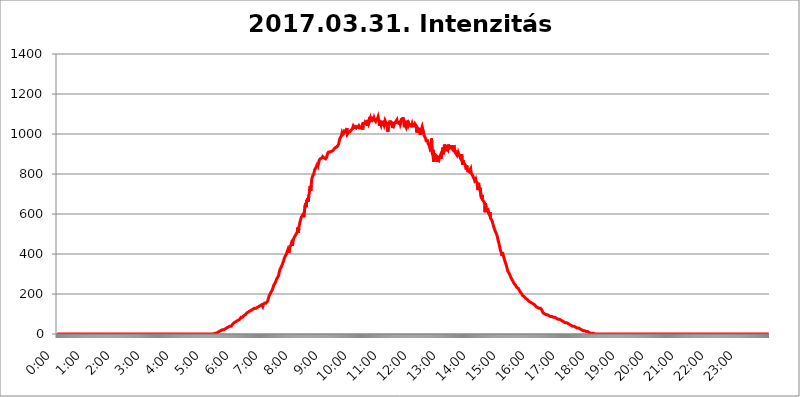
| Category | 2017.03.31. Intenzitás [W/m^2] |
|---|---|
| 0.0 | 0 |
| 0.0006944444444444445 | 0 |
| 0.001388888888888889 | 0 |
| 0.0020833333333333333 | 0 |
| 0.002777777777777778 | 0 |
| 0.003472222222222222 | 0 |
| 0.004166666666666667 | 0 |
| 0.004861111111111111 | 0 |
| 0.005555555555555556 | 0 |
| 0.0062499999999999995 | 0 |
| 0.006944444444444444 | 0 |
| 0.007638888888888889 | 0 |
| 0.008333333333333333 | 0 |
| 0.009027777777777779 | 0 |
| 0.009722222222222222 | 0 |
| 0.010416666666666666 | 0 |
| 0.011111111111111112 | 0 |
| 0.011805555555555555 | 0 |
| 0.012499999999999999 | 0 |
| 0.013194444444444444 | 0 |
| 0.013888888888888888 | 0 |
| 0.014583333333333332 | 0 |
| 0.015277777777777777 | 0 |
| 0.015972222222222224 | 0 |
| 0.016666666666666666 | 0 |
| 0.017361111111111112 | 0 |
| 0.018055555555555557 | 0 |
| 0.01875 | 0 |
| 0.019444444444444445 | 0 |
| 0.02013888888888889 | 0 |
| 0.020833333333333332 | 0 |
| 0.02152777777777778 | 0 |
| 0.022222222222222223 | 0 |
| 0.02291666666666667 | 0 |
| 0.02361111111111111 | 0 |
| 0.024305555555555556 | 0 |
| 0.024999999999999998 | 0 |
| 0.025694444444444447 | 0 |
| 0.02638888888888889 | 0 |
| 0.027083333333333334 | 0 |
| 0.027777777777777776 | 0 |
| 0.02847222222222222 | 0 |
| 0.029166666666666664 | 0 |
| 0.029861111111111113 | 0 |
| 0.030555555555555555 | 0 |
| 0.03125 | 0 |
| 0.03194444444444445 | 0 |
| 0.03263888888888889 | 0 |
| 0.03333333333333333 | 0 |
| 0.034027777777777775 | 0 |
| 0.034722222222222224 | 0 |
| 0.035416666666666666 | 0 |
| 0.036111111111111115 | 0 |
| 0.03680555555555556 | 0 |
| 0.0375 | 0 |
| 0.03819444444444444 | 0 |
| 0.03888888888888889 | 0 |
| 0.03958333333333333 | 0 |
| 0.04027777777777778 | 0 |
| 0.04097222222222222 | 0 |
| 0.041666666666666664 | 0 |
| 0.042361111111111106 | 0 |
| 0.04305555555555556 | 0 |
| 0.043750000000000004 | 0 |
| 0.044444444444444446 | 0 |
| 0.04513888888888889 | 0 |
| 0.04583333333333334 | 0 |
| 0.04652777777777778 | 0 |
| 0.04722222222222222 | 0 |
| 0.04791666666666666 | 0 |
| 0.04861111111111111 | 0 |
| 0.049305555555555554 | 0 |
| 0.049999999999999996 | 0 |
| 0.05069444444444445 | 0 |
| 0.051388888888888894 | 0 |
| 0.052083333333333336 | 0 |
| 0.05277777777777778 | 0 |
| 0.05347222222222222 | 0 |
| 0.05416666666666667 | 0 |
| 0.05486111111111111 | 0 |
| 0.05555555555555555 | 0 |
| 0.05625 | 0 |
| 0.05694444444444444 | 0 |
| 0.057638888888888885 | 0 |
| 0.05833333333333333 | 0 |
| 0.05902777777777778 | 0 |
| 0.059722222222222225 | 0 |
| 0.06041666666666667 | 0 |
| 0.061111111111111116 | 0 |
| 0.06180555555555556 | 0 |
| 0.0625 | 0 |
| 0.06319444444444444 | 0 |
| 0.06388888888888888 | 0 |
| 0.06458333333333334 | 0 |
| 0.06527777777777778 | 0 |
| 0.06597222222222222 | 0 |
| 0.06666666666666667 | 0 |
| 0.06736111111111111 | 0 |
| 0.06805555555555555 | 0 |
| 0.06874999999999999 | 0 |
| 0.06944444444444443 | 0 |
| 0.07013888888888889 | 0 |
| 0.07083333333333333 | 0 |
| 0.07152777777777779 | 0 |
| 0.07222222222222223 | 0 |
| 0.07291666666666667 | 0 |
| 0.07361111111111111 | 0 |
| 0.07430555555555556 | 0 |
| 0.075 | 0 |
| 0.07569444444444444 | 0 |
| 0.0763888888888889 | 0 |
| 0.07708333333333334 | 0 |
| 0.07777777777777778 | 0 |
| 0.07847222222222222 | 0 |
| 0.07916666666666666 | 0 |
| 0.0798611111111111 | 0 |
| 0.08055555555555556 | 0 |
| 0.08125 | 0 |
| 0.08194444444444444 | 0 |
| 0.08263888888888889 | 0 |
| 0.08333333333333333 | 0 |
| 0.08402777777777777 | 0 |
| 0.08472222222222221 | 0 |
| 0.08541666666666665 | 0 |
| 0.08611111111111112 | 0 |
| 0.08680555555555557 | 0 |
| 0.08750000000000001 | 0 |
| 0.08819444444444445 | 0 |
| 0.08888888888888889 | 0 |
| 0.08958333333333333 | 0 |
| 0.09027777777777778 | 0 |
| 0.09097222222222222 | 0 |
| 0.09166666666666667 | 0 |
| 0.09236111111111112 | 0 |
| 0.09305555555555556 | 0 |
| 0.09375 | 0 |
| 0.09444444444444444 | 0 |
| 0.09513888888888888 | 0 |
| 0.09583333333333333 | 0 |
| 0.09652777777777777 | 0 |
| 0.09722222222222222 | 0 |
| 0.09791666666666667 | 0 |
| 0.09861111111111111 | 0 |
| 0.09930555555555555 | 0 |
| 0.09999999999999999 | 0 |
| 0.10069444444444443 | 0 |
| 0.1013888888888889 | 0 |
| 0.10208333333333335 | 0 |
| 0.10277777777777779 | 0 |
| 0.10347222222222223 | 0 |
| 0.10416666666666667 | 0 |
| 0.10486111111111111 | 0 |
| 0.10555555555555556 | 0 |
| 0.10625 | 0 |
| 0.10694444444444444 | 0 |
| 0.1076388888888889 | 0 |
| 0.10833333333333334 | 0 |
| 0.10902777777777778 | 0 |
| 0.10972222222222222 | 0 |
| 0.1111111111111111 | 0 |
| 0.11180555555555556 | 0 |
| 0.11180555555555556 | 0 |
| 0.1125 | 0 |
| 0.11319444444444444 | 0 |
| 0.11388888888888889 | 0 |
| 0.11458333333333333 | 0 |
| 0.11527777777777777 | 0 |
| 0.11597222222222221 | 0 |
| 0.11666666666666665 | 0 |
| 0.1173611111111111 | 0 |
| 0.11805555555555557 | 0 |
| 0.11944444444444445 | 0 |
| 0.12013888888888889 | 0 |
| 0.12083333333333333 | 0 |
| 0.12152777777777778 | 0 |
| 0.12222222222222223 | 0 |
| 0.12291666666666667 | 0 |
| 0.12291666666666667 | 0 |
| 0.12361111111111112 | 0 |
| 0.12430555555555556 | 0 |
| 0.125 | 0 |
| 0.12569444444444444 | 0 |
| 0.12638888888888888 | 0 |
| 0.12708333333333333 | 0 |
| 0.16875 | 0 |
| 0.12847222222222224 | 0 |
| 0.12916666666666668 | 0 |
| 0.12986111111111112 | 0 |
| 0.13055555555555556 | 0 |
| 0.13125 | 0 |
| 0.13194444444444445 | 0 |
| 0.1326388888888889 | 0 |
| 0.13333333333333333 | 0 |
| 0.13402777777777777 | 0 |
| 0.13402777777777777 | 0 |
| 0.13472222222222222 | 0 |
| 0.13541666666666666 | 0 |
| 0.1361111111111111 | 0 |
| 0.13749999999999998 | 0 |
| 0.13819444444444443 | 0 |
| 0.1388888888888889 | 0 |
| 0.13958333333333334 | 0 |
| 0.14027777777777778 | 0 |
| 0.14097222222222222 | 0 |
| 0.14166666666666666 | 0 |
| 0.1423611111111111 | 0 |
| 0.14305555555555557 | 0 |
| 0.14375000000000002 | 0 |
| 0.14444444444444446 | 0 |
| 0.1451388888888889 | 0 |
| 0.1451388888888889 | 0 |
| 0.14652777777777778 | 0 |
| 0.14722222222222223 | 0 |
| 0.14791666666666667 | 0 |
| 0.1486111111111111 | 0 |
| 0.14930555555555555 | 0 |
| 0.15 | 0 |
| 0.15069444444444444 | 0 |
| 0.15138888888888888 | 0 |
| 0.15208333333333332 | 0 |
| 0.15277777777777776 | 0 |
| 0.15347222222222223 | 0 |
| 0.15416666666666667 | 0 |
| 0.15486111111111112 | 0 |
| 0.15555555555555556 | 0 |
| 0.15625 | 0 |
| 0.15694444444444444 | 0 |
| 0.15763888888888888 | 0 |
| 0.15833333333333333 | 0 |
| 0.15902777777777777 | 0 |
| 0.15972222222222224 | 0 |
| 0.16041666666666668 | 0 |
| 0.16111111111111112 | 0 |
| 0.16180555555555556 | 0 |
| 0.1625 | 0 |
| 0.16319444444444445 | 0 |
| 0.1638888888888889 | 0 |
| 0.16458333333333333 | 0 |
| 0.16527777777777777 | 0 |
| 0.16597222222222222 | 0 |
| 0.16666666666666666 | 0 |
| 0.1673611111111111 | 0 |
| 0.16805555555555554 | 0 |
| 0.16874999999999998 | 0 |
| 0.16944444444444443 | 0 |
| 0.17013888888888887 | 0 |
| 0.1708333333333333 | 0 |
| 0.17152777777777775 | 0 |
| 0.17222222222222225 | 0 |
| 0.1729166666666667 | 0 |
| 0.17361111111111113 | 0 |
| 0.17430555555555557 | 0 |
| 0.17500000000000002 | 0 |
| 0.17569444444444446 | 0 |
| 0.1763888888888889 | 0 |
| 0.17708333333333334 | 0 |
| 0.17777777777777778 | 0 |
| 0.17847222222222223 | 0 |
| 0.17916666666666667 | 0 |
| 0.1798611111111111 | 0 |
| 0.18055555555555555 | 0 |
| 0.18125 | 0 |
| 0.18194444444444444 | 0 |
| 0.1826388888888889 | 0 |
| 0.18333333333333335 | 0 |
| 0.1840277777777778 | 0 |
| 0.18472222222222223 | 0 |
| 0.18541666666666667 | 0 |
| 0.18611111111111112 | 0 |
| 0.18680555555555556 | 0 |
| 0.1875 | 0 |
| 0.18819444444444444 | 0 |
| 0.18888888888888888 | 0 |
| 0.18958333333333333 | 0 |
| 0.19027777777777777 | 0 |
| 0.1909722222222222 | 0 |
| 0.19166666666666665 | 0 |
| 0.19236111111111112 | 0 |
| 0.19305555555555554 | 0 |
| 0.19375 | 0 |
| 0.19444444444444445 | 0 |
| 0.1951388888888889 | 0 |
| 0.19583333333333333 | 0 |
| 0.19652777777777777 | 0 |
| 0.19722222222222222 | 0 |
| 0.19791666666666666 | 0 |
| 0.1986111111111111 | 0 |
| 0.19930555555555554 | 0 |
| 0.19999999999999998 | 0 |
| 0.20069444444444443 | 0 |
| 0.20138888888888887 | 0 |
| 0.2020833333333333 | 0 |
| 0.2027777777777778 | 0 |
| 0.2034722222222222 | 0 |
| 0.2041666666666667 | 0 |
| 0.20486111111111113 | 0 |
| 0.20555555555555557 | 0 |
| 0.20625000000000002 | 0 |
| 0.20694444444444446 | 0 |
| 0.2076388888888889 | 0 |
| 0.20833333333333334 | 0 |
| 0.20902777777777778 | 0 |
| 0.20972222222222223 | 0 |
| 0.21041666666666667 | 0 |
| 0.2111111111111111 | 0 |
| 0.21180555555555555 | 0 |
| 0.2125 | 0 |
| 0.21319444444444444 | 0 |
| 0.2138888888888889 | 0 |
| 0.21458333333333335 | 0 |
| 0.2152777777777778 | 0 |
| 0.21597222222222223 | 0 |
| 0.21666666666666667 | 0 |
| 0.21736111111111112 | 0 |
| 0.21805555555555556 | 0 |
| 0.21875 | 0 |
| 0.21944444444444444 | 0 |
| 0.22013888888888888 | 0 |
| 0.22083333333333333 | 3.525 |
| 0.22152777777777777 | 3.525 |
| 0.2222222222222222 | 3.525 |
| 0.22291666666666665 | 3.525 |
| 0.2236111111111111 | 3.525 |
| 0.22430555555555556 | 3.525 |
| 0.225 | 7.887 |
| 0.22569444444444445 | 7.887 |
| 0.2263888888888889 | 7.887 |
| 0.22708333333333333 | 12.257 |
| 0.22777777777777777 | 12.257 |
| 0.22847222222222222 | 12.257 |
| 0.22916666666666666 | 16.636 |
| 0.2298611111111111 | 16.636 |
| 0.23055555555555554 | 16.636 |
| 0.23124999999999998 | 21.024 |
| 0.23194444444444443 | 21.024 |
| 0.23263888888888887 | 21.024 |
| 0.2333333333333333 | 21.024 |
| 0.2340277777777778 | 25.419 |
| 0.2347222222222222 | 21.024 |
| 0.2354166666666667 | 25.419 |
| 0.23611111111111113 | 21.024 |
| 0.23680555555555557 | 25.419 |
| 0.23750000000000002 | 29.823 |
| 0.23819444444444446 | 29.823 |
| 0.2388888888888889 | 34.234 |
| 0.23958333333333334 | 34.234 |
| 0.24027777777777778 | 34.234 |
| 0.24097222222222223 | 38.653 |
| 0.24166666666666667 | 38.653 |
| 0.2423611111111111 | 38.653 |
| 0.24305555555555555 | 38.653 |
| 0.24375 | 38.653 |
| 0.24444444444444446 | 43.079 |
| 0.24513888888888888 | 43.079 |
| 0.24583333333333335 | 47.511 |
| 0.2465277777777778 | 47.511 |
| 0.24722222222222223 | 51.951 |
| 0.24791666666666667 | 56.398 |
| 0.24861111111111112 | 56.398 |
| 0.24930555555555556 | 60.85 |
| 0.25 | 60.85 |
| 0.25069444444444444 | 65.31 |
| 0.2513888888888889 | 65.31 |
| 0.2520833333333333 | 65.31 |
| 0.25277777777777777 | 65.31 |
| 0.2534722222222222 | 69.775 |
| 0.25416666666666665 | 69.775 |
| 0.2548611111111111 | 74.246 |
| 0.2555555555555556 | 74.246 |
| 0.25625000000000003 | 74.246 |
| 0.2569444444444445 | 74.246 |
| 0.2576388888888889 | 83.205 |
| 0.25833333333333336 | 83.205 |
| 0.2590277777777778 | 83.205 |
| 0.25972222222222224 | 83.205 |
| 0.2604166666666667 | 83.205 |
| 0.2611111111111111 | 87.692 |
| 0.26180555555555557 | 92.184 |
| 0.2625 | 92.184 |
| 0.26319444444444445 | 96.682 |
| 0.2638888888888889 | 96.682 |
| 0.26458333333333334 | 101.184 |
| 0.2652777777777778 | 101.184 |
| 0.2659722222222222 | 105.69 |
| 0.26666666666666666 | 105.69 |
| 0.2673611111111111 | 110.201 |
| 0.26805555555555555 | 110.201 |
| 0.26875 | 110.201 |
| 0.26944444444444443 | 114.716 |
| 0.2701388888888889 | 114.716 |
| 0.2708333333333333 | 119.235 |
| 0.27152777777777776 | 119.235 |
| 0.2722222222222222 | 119.235 |
| 0.27291666666666664 | 119.235 |
| 0.2736111111111111 | 123.758 |
| 0.2743055555555555 | 123.758 |
| 0.27499999999999997 | 123.758 |
| 0.27569444444444446 | 123.758 |
| 0.27638888888888885 | 128.284 |
| 0.27708333333333335 | 128.284 |
| 0.2777777777777778 | 128.284 |
| 0.27847222222222223 | 128.284 |
| 0.2791666666666667 | 128.284 |
| 0.2798611111111111 | 128.284 |
| 0.28055555555555556 | 132.814 |
| 0.28125 | 132.814 |
| 0.28194444444444444 | 137.347 |
| 0.2826388888888889 | 137.347 |
| 0.2833333333333333 | 141.884 |
| 0.28402777777777777 | 137.347 |
| 0.2847222222222222 | 141.884 |
| 0.28541666666666665 | 146.423 |
| 0.28611111111111115 | 141.884 |
| 0.28680555555555554 | 146.423 |
| 0.28750000000000003 | 141.884 |
| 0.2881944444444445 | 137.347 |
| 0.2888888888888889 | 146.423 |
| 0.28958333333333336 | 146.423 |
| 0.2902777777777778 | 146.423 |
| 0.29097222222222224 | 155.509 |
| 0.2916666666666667 | 155.509 |
| 0.2923611111111111 | 155.509 |
| 0.29305555555555557 | 155.509 |
| 0.29375 | 155.509 |
| 0.29444444444444445 | 160.056 |
| 0.2951388888888889 | 164.605 |
| 0.29583333333333334 | 173.709 |
| 0.2965277777777778 | 182.82 |
| 0.2972222222222222 | 191.937 |
| 0.29791666666666666 | 191.937 |
| 0.2986111111111111 | 201.058 |
| 0.29930555555555555 | 201.058 |
| 0.3 | 210.182 |
| 0.30069444444444443 | 214.746 |
| 0.3013888888888889 | 219.309 |
| 0.3020833333333333 | 219.309 |
| 0.30277777777777776 | 233 |
| 0.3034722222222222 | 242.127 |
| 0.30416666666666664 | 242.127 |
| 0.3048611111111111 | 251.251 |
| 0.3055555555555555 | 255.813 |
| 0.30624999999999997 | 260.373 |
| 0.3069444444444444 | 264.932 |
| 0.3076388888888889 | 274.047 |
| 0.30833333333333335 | 278.603 |
| 0.3090277777777778 | 283.156 |
| 0.30972222222222223 | 283.156 |
| 0.3104166666666667 | 292.259 |
| 0.3111111111111111 | 305.898 |
| 0.31180555555555556 | 314.98 |
| 0.3125 | 324.052 |
| 0.31319444444444444 | 324.052 |
| 0.3138888888888889 | 333.113 |
| 0.3145833333333333 | 333.113 |
| 0.31527777777777777 | 333.113 |
| 0.3159722222222222 | 351.198 |
| 0.31666666666666665 | 351.198 |
| 0.31736111111111115 | 364.728 |
| 0.31805555555555554 | 373.729 |
| 0.31875000000000003 | 378.224 |
| 0.3194444444444445 | 387.202 |
| 0.3201388888888889 | 391.685 |
| 0.32083333333333336 | 391.685 |
| 0.3215277777777778 | 400.638 |
| 0.32222222222222224 | 409.574 |
| 0.3229166666666667 | 409.574 |
| 0.3236111111111111 | 422.943 |
| 0.32430555555555557 | 422.943 |
| 0.325 | 405.108 |
| 0.32569444444444445 | 422.943 |
| 0.3263888888888889 | 436.27 |
| 0.32708333333333334 | 440.702 |
| 0.3277777777777778 | 445.129 |
| 0.3284722222222222 | 453.968 |
| 0.32916666666666666 | 449.551 |
| 0.3298611111111111 | 440.702 |
| 0.33055555555555555 | 462.786 |
| 0.33125 | 467.187 |
| 0.33194444444444443 | 480.356 |
| 0.3326388888888889 | 480.356 |
| 0.3333333333333333 | 489.108 |
| 0.3340277777777778 | 489.108 |
| 0.3347222222222222 | 497.836 |
| 0.3354166666666667 | 497.836 |
| 0.3361111111111111 | 506.542 |
| 0.3368055555555556 | 515.223 |
| 0.33749999999999997 | 532.513 |
| 0.33819444444444446 | 506.542 |
| 0.33888888888888885 | 532.513 |
| 0.33958333333333335 | 532.513 |
| 0.34027777777777773 | 558.261 |
| 0.34097222222222223 | 562.53 |
| 0.3416666666666666 | 562.53 |
| 0.3423611111111111 | 583.779 |
| 0.3430555555555555 | 588.009 |
| 0.34375 | 588.009 |
| 0.3444444444444445 | 596.45 |
| 0.3451388888888889 | 592.233 |
| 0.3458333333333334 | 583.779 |
| 0.34652777777777777 | 600.661 |
| 0.34722222222222227 | 638.256 |
| 0.34791666666666665 | 646.537 |
| 0.34861111111111115 | 654.791 |
| 0.34930555555555554 | 634.105 |
| 0.35000000000000003 | 671.22 |
| 0.3506944444444444 | 663.019 |
| 0.3513888888888889 | 679.395 |
| 0.3520833333333333 | 663.019 |
| 0.3527777777777778 | 691.608 |
| 0.3534722222222222 | 703.762 |
| 0.3541666666666667 | 731.896 |
| 0.3548611111111111 | 739.877 |
| 0.35555555555555557 | 715.858 |
| 0.35625 | 743.859 |
| 0.35694444444444445 | 775.492 |
| 0.3576388888888889 | 783.342 |
| 0.35833333333333334 | 791.169 |
| 0.3590277777777778 | 791.169 |
| 0.3597222222222222 | 798.974 |
| 0.36041666666666666 | 810.641 |
| 0.3611111111111111 | 822.26 |
| 0.36180555555555555 | 826.123 |
| 0.3625 | 829.981 |
| 0.36319444444444443 | 829.981 |
| 0.3638888888888889 | 841.526 |
| 0.3645833333333333 | 833.834 |
| 0.3652777777777778 | 853.029 |
| 0.3659722222222222 | 845.365 |
| 0.3666666666666667 | 856.855 |
| 0.3673611111111111 | 868.305 |
| 0.3680555555555556 | 868.305 |
| 0.36874999999999997 | 875.918 |
| 0.36944444444444446 | 875.918 |
| 0.37013888888888885 | 875.918 |
| 0.37083333333333335 | 879.719 |
| 0.37152777777777773 | 883.516 |
| 0.37222222222222223 | 887.309 |
| 0.3729166666666666 | 887.309 |
| 0.3736111111111111 | 887.309 |
| 0.3743055555555555 | 879.719 |
| 0.375 | 879.719 |
| 0.3756944444444445 | 875.918 |
| 0.3763888888888889 | 875.918 |
| 0.3770833333333334 | 875.918 |
| 0.37777777777777777 | 883.516 |
| 0.37847222222222227 | 879.719 |
| 0.37916666666666665 | 902.447 |
| 0.37986111111111115 | 906.223 |
| 0.38055555555555554 | 909.996 |
| 0.38125000000000003 | 913.766 |
| 0.3819444444444444 | 909.996 |
| 0.3826388888888889 | 909.996 |
| 0.3833333333333333 | 913.766 |
| 0.3840277777777778 | 906.223 |
| 0.3847222222222222 | 913.766 |
| 0.3854166666666667 | 913.766 |
| 0.3861111111111111 | 909.996 |
| 0.38680555555555557 | 917.534 |
| 0.3875 | 921.298 |
| 0.38819444444444445 | 925.06 |
| 0.3888888888888889 | 921.298 |
| 0.38958333333333334 | 928.819 |
| 0.3902777777777778 | 932.576 |
| 0.3909722222222222 | 932.576 |
| 0.39166666666666666 | 932.576 |
| 0.3923611111111111 | 936.33 |
| 0.39305555555555555 | 940.082 |
| 0.39375 | 940.082 |
| 0.39444444444444443 | 947.58 |
| 0.3951388888888889 | 958.814 |
| 0.3958333333333333 | 970.034 |
| 0.3965277777777778 | 977.508 |
| 0.3972222222222222 | 981.244 |
| 0.3979166666666667 | 977.508 |
| 0.3986111111111111 | 992.448 |
| 0.3993055555555556 | 1003.65 |
| 0.39999999999999997 | 996.182 |
| 0.40069444444444446 | 996.182 |
| 0.40138888888888885 | 996.182 |
| 0.40208333333333335 | 1003.65 |
| 0.40277777777777773 | 1014.852 |
| 0.40347222222222223 | 1011.118 |
| 0.4041666666666666 | 1014.852 |
| 0.4048611111111111 | 1011.118 |
| 0.4055555555555555 | 1022.323 |
| 0.40625 | 1029.798 |
| 0.4069444444444445 | 999.916 |
| 0.4076388888888889 | 996.182 |
| 0.4083333333333334 | 1007.383 |
| 0.40902777777777777 | 1007.383 |
| 0.40972222222222227 | 1011.118 |
| 0.41041666666666665 | 1011.118 |
| 0.41111111111111115 | 1011.118 |
| 0.41180555555555554 | 1018.587 |
| 0.41250000000000003 | 1022.323 |
| 0.4131944444444444 | 1018.587 |
| 0.4138888888888889 | 1026.06 |
| 0.4145833333333333 | 1026.06 |
| 0.4152777777777778 | 1041.019 |
| 0.4159722222222222 | 1041.019 |
| 0.4166666666666667 | 1033.537 |
| 0.4173611111111111 | 1029.798 |
| 0.41805555555555557 | 1033.537 |
| 0.41875 | 1029.798 |
| 0.41944444444444445 | 1037.277 |
| 0.4201388888888889 | 1041.019 |
| 0.42083333333333334 | 1033.537 |
| 0.4215277777777778 | 1033.537 |
| 0.4222222222222222 | 1037.277 |
| 0.42291666666666666 | 1041.019 |
| 0.4236111111111111 | 1037.277 |
| 0.42430555555555555 | 1029.798 |
| 0.425 | 1029.798 |
| 0.42569444444444443 | 1029.798 |
| 0.4263888888888889 | 1029.798 |
| 0.4270833333333333 | 1037.277 |
| 0.4277777777777778 | 1041.019 |
| 0.4284722222222222 | 1022.323 |
| 0.4291666666666667 | 1052.255 |
| 0.4298611111111111 | 1052.255 |
| 0.4305555555555556 | 1052.255 |
| 0.43124999999999997 | 1052.255 |
| 0.43194444444444446 | 1059.756 |
| 0.43263888888888885 | 1056.004 |
| 0.43333333333333335 | 1063.51 |
| 0.43402777777777773 | 1052.255 |
| 0.43472222222222223 | 1041.019 |
| 0.4354166666666666 | 1071.027 |
| 0.4361111111111111 | 1067.267 |
| 0.4368055555555555 | 1052.255 |
| 0.4375 | 1059.756 |
| 0.4381944444444445 | 1086.097 |
| 0.4388888888888889 | 1067.267 |
| 0.4395833333333334 | 1078.555 |
| 0.44027777777777777 | 1071.027 |
| 0.44097222222222227 | 1059.756 |
| 0.44166666666666665 | 1078.555 |
| 0.44236111111111115 | 1067.267 |
| 0.44305555555555554 | 1086.097 |
| 0.44375000000000003 | 1067.267 |
| 0.4444444444444444 | 1078.555 |
| 0.4451388888888889 | 1071.027 |
| 0.4458333333333333 | 1071.027 |
| 0.4465277777777778 | 1063.51 |
| 0.4472222222222222 | 1071.027 |
| 0.4479166666666667 | 1067.267 |
| 0.4486111111111111 | 1074.789 |
| 0.44930555555555557 | 1078.555 |
| 0.45 | 1086.097 |
| 0.45069444444444445 | 1074.789 |
| 0.4513888888888889 | 1056.004 |
| 0.45208333333333334 | 1041.019 |
| 0.4527777777777778 | 1067.267 |
| 0.4534722222222222 | 1052.255 |
| 0.45416666666666666 | 1044.762 |
| 0.4548611111111111 | 1056.004 |
| 0.45555555555555555 | 1052.255 |
| 0.45625 | 1059.756 |
| 0.45694444444444443 | 1059.756 |
| 0.4576388888888889 | 1052.255 |
| 0.4583333333333333 | 1044.762 |
| 0.4590277777777778 | 1048.508 |
| 0.4597222222222222 | 1067.267 |
| 0.4604166666666667 | 1063.51 |
| 0.4611111111111111 | 1056.004 |
| 0.4618055555555556 | 1048.508 |
| 0.46249999999999997 | 1041.019 |
| 0.46319444444444446 | 1044.762 |
| 0.46388888888888885 | 1011.118 |
| 0.46458333333333335 | 1059.756 |
| 0.46527777777777773 | 1044.762 |
| 0.46597222222222223 | 1052.255 |
| 0.4666666666666666 | 1067.267 |
| 0.4673611111111111 | 1056.004 |
| 0.4680555555555555 | 1059.756 |
| 0.46875 | 1059.756 |
| 0.4694444444444445 | 1056.004 |
| 0.4701388888888889 | 1029.798 |
| 0.4708333333333334 | 1033.537 |
| 0.47152777777777777 | 1044.762 |
| 0.47222222222222227 | 1059.756 |
| 0.47291666666666665 | 1048.508 |
| 0.47361111111111115 | 1044.762 |
| 0.47430555555555554 | 1059.756 |
| 0.47500000000000003 | 1056.004 |
| 0.4756944444444444 | 1063.51 |
| 0.4763888888888889 | 1071.027 |
| 0.4770833333333333 | 1056.004 |
| 0.4777777777777778 | 1052.255 |
| 0.4784722222222222 | 1056.004 |
| 0.4791666666666667 | 1052.255 |
| 0.4798611111111111 | 1048.508 |
| 0.48055555555555557 | 1059.756 |
| 0.48125 | 1048.508 |
| 0.48194444444444445 | 1044.762 |
| 0.4826388888888889 | 1063.51 |
| 0.48333333333333334 | 1078.555 |
| 0.4840277777777778 | 1059.756 |
| 0.4847222222222222 | 1082.324 |
| 0.48541666666666666 | 1074.789 |
| 0.4861111111111111 | 1059.756 |
| 0.48680555555555555 | 1033.537 |
| 0.4875 | 1033.537 |
| 0.48819444444444443 | 1048.508 |
| 0.4888888888888889 | 1044.762 |
| 0.4895833333333333 | 1033.537 |
| 0.4902777777777778 | 1041.019 |
| 0.4909722222222222 | 1067.267 |
| 0.4916666666666667 | 1056.004 |
| 0.4923611111111111 | 1044.762 |
| 0.4930555555555556 | 1052.255 |
| 0.49374999999999997 | 1044.762 |
| 0.49444444444444446 | 1044.762 |
| 0.49513888888888885 | 1044.762 |
| 0.49583333333333335 | 1044.762 |
| 0.49652777777777773 | 1033.537 |
| 0.49722222222222223 | 1029.798 |
| 0.4979166666666666 | 1052.255 |
| 0.4986111111111111 | 1052.255 |
| 0.4993055555555555 | 1037.277 |
| 0.5 | 1052.255 |
| 0.5006944444444444 | 1044.762 |
| 0.5013888888888889 | 1033.537 |
| 0.5020833333333333 | 1048.508 |
| 0.5027777777777778 | 1048.508 |
| 0.5034722222222222 | 1041.019 |
| 0.5041666666666667 | 1007.383 |
| 0.5048611111111111 | 1011.118 |
| 0.5055555555555555 | 1029.798 |
| 0.50625 | 1033.537 |
| 0.5069444444444444 | 1033.537 |
| 0.5076388888888889 | 1022.323 |
| 0.5083333333333333 | 1022.323 |
| 0.5090277777777777 | 996.182 |
| 0.5097222222222222 | 1014.852 |
| 0.5104166666666666 | 1022.323 |
| 0.5111111111111112 | 1029.798 |
| 0.5118055555555555 | 1037.277 |
| 0.5125000000000001 | 1026.06 |
| 0.5131944444444444 | 1018.587 |
| 0.513888888888889 | 999.916 |
| 0.5145833333333333 | 992.448 |
| 0.5152777777777778 | 992.448 |
| 0.5159722222222222 | 988.714 |
| 0.5166666666666667 | 977.508 |
| 0.517361111111111 | 966.295 |
| 0.5180555555555556 | 970.034 |
| 0.5187499999999999 | 966.295 |
| 0.5194444444444445 | 966.295 |
| 0.5201388888888888 | 951.327 |
| 0.5208333333333334 | 955.071 |
| 0.5215277777777778 | 943.832 |
| 0.5222222222222223 | 940.082 |
| 0.5229166666666667 | 925.06 |
| 0.5236111111111111 | 928.819 |
| 0.5243055555555556 | 932.576 |
| 0.525 | 977.508 |
| 0.5256944444444445 | 909.996 |
| 0.5263888888888889 | 894.885 |
| 0.5270833333333333 | 921.298 |
| 0.5277777777777778 | 860.676 |
| 0.5284722222222222 | 902.447 |
| 0.5291666666666667 | 902.447 |
| 0.5298611111111111 | 906.223 |
| 0.5305555555555556 | 894.885 |
| 0.53125 | 887.309 |
| 0.5319444444444444 | 875.918 |
| 0.5326388888888889 | 860.676 |
| 0.5333333333333333 | 868.305 |
| 0.5340277777777778 | 879.719 |
| 0.5347222222222222 | 879.719 |
| 0.5354166666666667 | 872.114 |
| 0.5361111111111111 | 883.516 |
| 0.5368055555555555 | 887.309 |
| 0.5375 | 894.885 |
| 0.5381944444444444 | 875.918 |
| 0.5388888888888889 | 891.099 |
| 0.5395833333333333 | 902.447 |
| 0.5402777777777777 | 913.766 |
| 0.5409722222222222 | 932.576 |
| 0.5416666666666666 | 898.668 |
| 0.5423611111111112 | 925.06 |
| 0.5430555555555555 | 947.58 |
| 0.5437500000000001 | 940.082 |
| 0.5444444444444444 | 940.082 |
| 0.545138888888889 | 940.082 |
| 0.5458333333333333 | 913.766 |
| 0.5465277777777778 | 928.819 |
| 0.5472222222222222 | 932.576 |
| 0.5479166666666667 | 921.298 |
| 0.548611111111111 | 947.58 |
| 0.5493055555555556 | 947.58 |
| 0.5499999999999999 | 928.819 |
| 0.5506944444444445 | 932.576 |
| 0.5513888888888888 | 925.06 |
| 0.5520833333333334 | 932.576 |
| 0.5527777777777778 | 943.832 |
| 0.5534722222222223 | 928.819 |
| 0.5541666666666667 | 925.06 |
| 0.5548611111111111 | 921.298 |
| 0.5555555555555556 | 928.819 |
| 0.55625 | 943.832 |
| 0.5569444444444445 | 936.33 |
| 0.5576388888888889 | 909.996 |
| 0.5583333333333333 | 917.534 |
| 0.5590277777777778 | 902.447 |
| 0.5597222222222222 | 906.223 |
| 0.5604166666666667 | 894.885 |
| 0.5611111111111111 | 906.223 |
| 0.5618055555555556 | 894.885 |
| 0.5625 | 906.223 |
| 0.5631944444444444 | 898.668 |
| 0.5638888888888889 | 898.668 |
| 0.5645833333333333 | 887.309 |
| 0.5652777777777778 | 898.668 |
| 0.5659722222222222 | 887.309 |
| 0.5666666666666667 | 883.516 |
| 0.5673611111111111 | 898.668 |
| 0.5680555555555555 | 860.676 |
| 0.56875 | 845.365 |
| 0.5694444444444444 | 868.305 |
| 0.5701388888888889 | 856.855 |
| 0.5708333333333333 | 853.029 |
| 0.5715277777777777 | 853.029 |
| 0.5722222222222222 | 845.365 |
| 0.5729166666666666 | 849.199 |
| 0.5736111111111112 | 822.26 |
| 0.5743055555555555 | 841.526 |
| 0.5750000000000001 | 833.834 |
| 0.5756944444444444 | 814.519 |
| 0.576388888888889 | 810.641 |
| 0.5770833333333333 | 818.392 |
| 0.5777777777777778 | 810.641 |
| 0.5784722222222222 | 814.519 |
| 0.5791666666666667 | 814.519 |
| 0.579861111111111 | 826.123 |
| 0.5805555555555556 | 806.757 |
| 0.5812499999999999 | 806.757 |
| 0.5819444444444445 | 806.757 |
| 0.5826388888888888 | 791.169 |
| 0.5833333333333334 | 791.169 |
| 0.5840277777777778 | 787.258 |
| 0.5847222222222223 | 775.492 |
| 0.5854166666666667 | 767.62 |
| 0.5861111111111111 | 767.62 |
| 0.5868055555555556 | 775.492 |
| 0.5875 | 763.674 |
| 0.5881944444444445 | 759.723 |
| 0.5888888888888889 | 755.766 |
| 0.5895833333333333 | 727.896 |
| 0.5902777777777778 | 719.877 |
| 0.5909722222222222 | 755.766 |
| 0.5916666666666667 | 731.896 |
| 0.5923611111111111 | 723.889 |
| 0.5930555555555556 | 731.896 |
| 0.59375 | 735.89 |
| 0.5944444444444444 | 687.544 |
| 0.5951388888888889 | 675.311 |
| 0.5958333333333333 | 695.666 |
| 0.5965277777777778 | 671.22 |
| 0.5972222222222222 | 667.123 |
| 0.5979166666666667 | 663.019 |
| 0.5986111111111111 | 667.123 |
| 0.5993055555555555 | 654.791 |
| 0.6 | 609.062 |
| 0.6006944444444444 | 654.791 |
| 0.6013888888888889 | 650.667 |
| 0.6020833333333333 | 613.252 |
| 0.6027777777777777 | 617.436 |
| 0.6034722222222222 | 629.948 |
| 0.6041666666666666 | 629.948 |
| 0.6048611111111112 | 604.864 |
| 0.6055555555555555 | 600.661 |
| 0.6062500000000001 | 596.45 |
| 0.6069444444444444 | 609.062 |
| 0.607638888888889 | 579.542 |
| 0.6083333333333333 | 575.299 |
| 0.6090277777777778 | 579.542 |
| 0.6097222222222222 | 566.793 |
| 0.6104166666666667 | 562.53 |
| 0.611111111111111 | 549.704 |
| 0.6118055555555556 | 541.121 |
| 0.6124999999999999 | 532.513 |
| 0.6131944444444445 | 532.513 |
| 0.6138888888888888 | 528.2 |
| 0.6145833333333334 | 510.885 |
| 0.6152777777777778 | 515.223 |
| 0.6159722222222223 | 502.192 |
| 0.6166666666666667 | 493.475 |
| 0.6173611111111111 | 484.735 |
| 0.6180555555555556 | 471.582 |
| 0.61875 | 467.187 |
| 0.6194444444444445 | 453.968 |
| 0.6201388888888889 | 440.702 |
| 0.6208333333333333 | 431.833 |
| 0.6215277777777778 | 418.492 |
| 0.6222222222222222 | 414.035 |
| 0.6229166666666667 | 405.108 |
| 0.6236111111111111 | 391.685 |
| 0.6243055555555556 | 409.574 |
| 0.625 | 400.638 |
| 0.6256944444444444 | 391.685 |
| 0.6263888888888889 | 382.715 |
| 0.6270833333333333 | 373.729 |
| 0.6277777777777778 | 364.728 |
| 0.6284722222222222 | 360.221 |
| 0.6291666666666667 | 351.198 |
| 0.6298611111111111 | 342.162 |
| 0.6305555555555555 | 333.113 |
| 0.63125 | 324.052 |
| 0.6319444444444444 | 314.98 |
| 0.6326388888888889 | 314.98 |
| 0.6333333333333333 | 305.898 |
| 0.6340277777777777 | 301.354 |
| 0.6347222222222222 | 296.808 |
| 0.6354166666666666 | 292.259 |
| 0.6361111111111112 | 283.156 |
| 0.6368055555555555 | 278.603 |
| 0.6375000000000001 | 274.047 |
| 0.6381944444444444 | 269.49 |
| 0.638888888888889 | 264.932 |
| 0.6395833333333333 | 260.373 |
| 0.6402777777777778 | 260.373 |
| 0.6409722222222222 | 251.251 |
| 0.6416666666666667 | 251.251 |
| 0.642361111111111 | 246.689 |
| 0.6430555555555556 | 242.127 |
| 0.6437499999999999 | 237.564 |
| 0.6444444444444445 | 233 |
| 0.6451388888888888 | 233 |
| 0.6458333333333334 | 228.436 |
| 0.6465277777777778 | 228.436 |
| 0.6472222222222223 | 223.873 |
| 0.6479166666666667 | 219.309 |
| 0.6486111111111111 | 214.746 |
| 0.6493055555555556 | 210.182 |
| 0.65 | 210.182 |
| 0.6506944444444445 | 205.62 |
| 0.6513888888888889 | 201.058 |
| 0.6520833333333333 | 196.497 |
| 0.6527777777777778 | 191.937 |
| 0.6534722222222222 | 191.937 |
| 0.6541666666666667 | 187.378 |
| 0.6548611111111111 | 187.378 |
| 0.6555555555555556 | 182.82 |
| 0.65625 | 182.82 |
| 0.6569444444444444 | 178.264 |
| 0.6576388888888889 | 173.709 |
| 0.6583333333333333 | 173.709 |
| 0.6590277777777778 | 173.709 |
| 0.6597222222222222 | 169.156 |
| 0.6604166666666667 | 169.156 |
| 0.6611111111111111 | 164.605 |
| 0.6618055555555555 | 164.605 |
| 0.6625 | 160.056 |
| 0.6631944444444444 | 160.056 |
| 0.6638888888888889 | 155.509 |
| 0.6645833333333333 | 155.509 |
| 0.6652777777777777 | 155.509 |
| 0.6659722222222222 | 150.964 |
| 0.6666666666666666 | 150.964 |
| 0.6673611111111111 | 150.964 |
| 0.6680555555555556 | 146.423 |
| 0.6687500000000001 | 146.423 |
| 0.6694444444444444 | 146.423 |
| 0.6701388888888888 | 141.884 |
| 0.6708333333333334 | 141.884 |
| 0.6715277777777778 | 137.347 |
| 0.6722222222222222 | 137.347 |
| 0.6729166666666666 | 137.347 |
| 0.6736111111111112 | 132.814 |
| 0.6743055555555556 | 132.814 |
| 0.6749999999999999 | 132.814 |
| 0.6756944444444444 | 128.284 |
| 0.6763888888888889 | 128.284 |
| 0.6770833333333334 | 128.284 |
| 0.6777777777777777 | 128.284 |
| 0.6784722222222223 | 128.284 |
| 0.6791666666666667 | 123.758 |
| 0.6798611111111111 | 119.235 |
| 0.6805555555555555 | 114.716 |
| 0.68125 | 105.69 |
| 0.6819444444444445 | 101.184 |
| 0.6826388888888889 | 101.184 |
| 0.6833333333333332 | 101.184 |
| 0.6840277777777778 | 96.682 |
| 0.6847222222222222 | 96.682 |
| 0.6854166666666667 | 96.682 |
| 0.686111111111111 | 96.682 |
| 0.6868055555555556 | 96.682 |
| 0.6875 | 96.682 |
| 0.6881944444444444 | 92.184 |
| 0.688888888888889 | 92.184 |
| 0.6895833333333333 | 92.184 |
| 0.6902777777777778 | 92.184 |
| 0.6909722222222222 | 92.184 |
| 0.6916666666666668 | 87.692 |
| 0.6923611111111111 | 87.692 |
| 0.6930555555555555 | 87.692 |
| 0.69375 | 87.692 |
| 0.6944444444444445 | 83.205 |
| 0.6951388888888889 | 83.205 |
| 0.6958333333333333 | 83.205 |
| 0.6965277777777777 | 83.205 |
| 0.6972222222222223 | 83.205 |
| 0.6979166666666666 | 83.205 |
| 0.6986111111111111 | 78.722 |
| 0.6993055555555556 | 78.722 |
| 0.7000000000000001 | 78.722 |
| 0.7006944444444444 | 78.722 |
| 0.7013888888888888 | 74.246 |
| 0.7020833333333334 | 74.246 |
| 0.7027777777777778 | 74.246 |
| 0.7034722222222222 | 74.246 |
| 0.7041666666666666 | 74.246 |
| 0.7048611111111112 | 69.775 |
| 0.7055555555555556 | 69.775 |
| 0.7062499999999999 | 69.775 |
| 0.7069444444444444 | 65.31 |
| 0.7076388888888889 | 65.31 |
| 0.7083333333333334 | 65.31 |
| 0.7090277777777777 | 65.31 |
| 0.7097222222222223 | 65.31 |
| 0.7104166666666667 | 60.85 |
| 0.7111111111111111 | 60.85 |
| 0.7118055555555555 | 60.85 |
| 0.7125 | 56.398 |
| 0.7131944444444445 | 56.398 |
| 0.7138888888888889 | 56.398 |
| 0.7145833333333332 | 56.398 |
| 0.7152777777777778 | 56.398 |
| 0.7159722222222222 | 51.951 |
| 0.7166666666666667 | 51.951 |
| 0.717361111111111 | 51.951 |
| 0.7180555555555556 | 47.511 |
| 0.71875 | 47.511 |
| 0.7194444444444444 | 47.511 |
| 0.720138888888889 | 43.079 |
| 0.7208333333333333 | 43.079 |
| 0.7215277777777778 | 43.079 |
| 0.7222222222222222 | 43.079 |
| 0.7229166666666668 | 38.653 |
| 0.7236111111111111 | 38.653 |
| 0.7243055555555555 | 38.653 |
| 0.725 | 38.653 |
| 0.7256944444444445 | 34.234 |
| 0.7263888888888889 | 34.234 |
| 0.7270833333333333 | 34.234 |
| 0.7277777777777777 | 29.823 |
| 0.7284722222222223 | 29.823 |
| 0.7291666666666666 | 29.823 |
| 0.7298611111111111 | 29.823 |
| 0.7305555555555556 | 29.823 |
| 0.7312500000000001 | 29.823 |
| 0.7319444444444444 | 25.419 |
| 0.7326388888888888 | 25.419 |
| 0.7333333333333334 | 25.419 |
| 0.7340277777777778 | 21.024 |
| 0.7347222222222222 | 21.024 |
| 0.7354166666666666 | 21.024 |
| 0.7361111111111112 | 21.024 |
| 0.7368055555555556 | 16.636 |
| 0.7374999999999999 | 16.636 |
| 0.7381944444444444 | 16.636 |
| 0.7388888888888889 | 16.636 |
| 0.7395833333333334 | 16.636 |
| 0.7402777777777777 | 16.636 |
| 0.7409722222222223 | 12.257 |
| 0.7416666666666667 | 12.257 |
| 0.7423611111111111 | 12.257 |
| 0.7430555555555555 | 12.257 |
| 0.74375 | 12.257 |
| 0.7444444444444445 | 7.887 |
| 0.7451388888888889 | 7.887 |
| 0.7458333333333332 | 7.887 |
| 0.7465277777777778 | 7.887 |
| 0.7472222222222222 | 7.887 |
| 0.7479166666666667 | 3.525 |
| 0.748611111111111 | 3.525 |
| 0.7493055555555556 | 3.525 |
| 0.75 | 3.525 |
| 0.7506944444444444 | 3.525 |
| 0.751388888888889 | 3.525 |
| 0.7520833333333333 | 3.525 |
| 0.7527777777777778 | 3.525 |
| 0.7534722222222222 | 0 |
| 0.7541666666666668 | 0 |
| 0.7548611111111111 | 0 |
| 0.7555555555555555 | 0 |
| 0.75625 | 0 |
| 0.7569444444444445 | 0 |
| 0.7576388888888889 | 0 |
| 0.7583333333333333 | 0 |
| 0.7590277777777777 | 0 |
| 0.7597222222222223 | 0 |
| 0.7604166666666666 | 0 |
| 0.7611111111111111 | 0 |
| 0.7618055555555556 | 0 |
| 0.7625000000000001 | 0 |
| 0.7631944444444444 | 0 |
| 0.7638888888888888 | 0 |
| 0.7645833333333334 | 0 |
| 0.7652777777777778 | 0 |
| 0.7659722222222222 | 0 |
| 0.7666666666666666 | 0 |
| 0.7673611111111112 | 0 |
| 0.7680555555555556 | 0 |
| 0.7687499999999999 | 0 |
| 0.7694444444444444 | 0 |
| 0.7701388888888889 | 0 |
| 0.7708333333333334 | 0 |
| 0.7715277777777777 | 0 |
| 0.7722222222222223 | 0 |
| 0.7729166666666667 | 0 |
| 0.7736111111111111 | 0 |
| 0.7743055555555555 | 0 |
| 0.775 | 0 |
| 0.7756944444444445 | 0 |
| 0.7763888888888889 | 0 |
| 0.7770833333333332 | 0 |
| 0.7777777777777778 | 0 |
| 0.7784722222222222 | 0 |
| 0.7791666666666667 | 0 |
| 0.779861111111111 | 0 |
| 0.7805555555555556 | 0 |
| 0.78125 | 0 |
| 0.7819444444444444 | 0 |
| 0.782638888888889 | 0 |
| 0.7833333333333333 | 0 |
| 0.7840277777777778 | 0 |
| 0.7847222222222222 | 0 |
| 0.7854166666666668 | 0 |
| 0.7861111111111111 | 0 |
| 0.7868055555555555 | 0 |
| 0.7875 | 0 |
| 0.7881944444444445 | 0 |
| 0.7888888888888889 | 0 |
| 0.7895833333333333 | 0 |
| 0.7902777777777777 | 0 |
| 0.7909722222222223 | 0 |
| 0.7916666666666666 | 0 |
| 0.7923611111111111 | 0 |
| 0.7930555555555556 | 0 |
| 0.7937500000000001 | 0 |
| 0.7944444444444444 | 0 |
| 0.7951388888888888 | 0 |
| 0.7958333333333334 | 0 |
| 0.7965277777777778 | 0 |
| 0.7972222222222222 | 0 |
| 0.7979166666666666 | 0 |
| 0.7986111111111112 | 0 |
| 0.7993055555555556 | 0 |
| 0.7999999999999999 | 0 |
| 0.8006944444444444 | 0 |
| 0.8013888888888889 | 0 |
| 0.8020833333333334 | 0 |
| 0.8027777777777777 | 0 |
| 0.8034722222222223 | 0 |
| 0.8041666666666667 | 0 |
| 0.8048611111111111 | 0 |
| 0.8055555555555555 | 0 |
| 0.80625 | 0 |
| 0.8069444444444445 | 0 |
| 0.8076388888888889 | 0 |
| 0.8083333333333332 | 0 |
| 0.8090277777777778 | 0 |
| 0.8097222222222222 | 0 |
| 0.8104166666666667 | 0 |
| 0.811111111111111 | 0 |
| 0.8118055555555556 | 0 |
| 0.8125 | 0 |
| 0.8131944444444444 | 0 |
| 0.813888888888889 | 0 |
| 0.8145833333333333 | 0 |
| 0.8152777777777778 | 0 |
| 0.8159722222222222 | 0 |
| 0.8166666666666668 | 0 |
| 0.8173611111111111 | 0 |
| 0.8180555555555555 | 0 |
| 0.81875 | 0 |
| 0.8194444444444445 | 0 |
| 0.8201388888888889 | 0 |
| 0.8208333333333333 | 0 |
| 0.8215277777777777 | 0 |
| 0.8222222222222223 | 0 |
| 0.8229166666666666 | 0 |
| 0.8236111111111111 | 0 |
| 0.8243055555555556 | 0 |
| 0.8250000000000001 | 0 |
| 0.8256944444444444 | 0 |
| 0.8263888888888888 | 0 |
| 0.8270833333333334 | 0 |
| 0.8277777777777778 | 0 |
| 0.8284722222222222 | 0 |
| 0.8291666666666666 | 0 |
| 0.8298611111111112 | 0 |
| 0.8305555555555556 | 0 |
| 0.8312499999999999 | 0 |
| 0.8319444444444444 | 0 |
| 0.8326388888888889 | 0 |
| 0.8333333333333334 | 0 |
| 0.8340277777777777 | 0 |
| 0.8347222222222223 | 0 |
| 0.8354166666666667 | 0 |
| 0.8361111111111111 | 0 |
| 0.8368055555555555 | 0 |
| 0.8375 | 0 |
| 0.8381944444444445 | 0 |
| 0.8388888888888889 | 0 |
| 0.8395833333333332 | 0 |
| 0.8402777777777778 | 0 |
| 0.8409722222222222 | 0 |
| 0.8416666666666667 | 0 |
| 0.842361111111111 | 0 |
| 0.8430555555555556 | 0 |
| 0.84375 | 0 |
| 0.8444444444444444 | 0 |
| 0.845138888888889 | 0 |
| 0.8458333333333333 | 0 |
| 0.8465277777777778 | 0 |
| 0.8472222222222222 | 0 |
| 0.8479166666666668 | 0 |
| 0.8486111111111111 | 0 |
| 0.8493055555555555 | 0 |
| 0.85 | 0 |
| 0.8506944444444445 | 0 |
| 0.8513888888888889 | 0 |
| 0.8520833333333333 | 0 |
| 0.8527777777777777 | 0 |
| 0.8534722222222223 | 0 |
| 0.8541666666666666 | 0 |
| 0.8548611111111111 | 0 |
| 0.8555555555555556 | 0 |
| 0.8562500000000001 | 0 |
| 0.8569444444444444 | 0 |
| 0.8576388888888888 | 0 |
| 0.8583333333333334 | 0 |
| 0.8590277777777778 | 0 |
| 0.8597222222222222 | 0 |
| 0.8604166666666666 | 0 |
| 0.8611111111111112 | 0 |
| 0.8618055555555556 | 0 |
| 0.8624999999999999 | 0 |
| 0.8631944444444444 | 0 |
| 0.8638888888888889 | 0 |
| 0.8645833333333334 | 0 |
| 0.8652777777777777 | 0 |
| 0.8659722222222223 | 0 |
| 0.8666666666666667 | 0 |
| 0.8673611111111111 | 0 |
| 0.8680555555555555 | 0 |
| 0.86875 | 0 |
| 0.8694444444444445 | 0 |
| 0.8701388888888889 | 0 |
| 0.8708333333333332 | 0 |
| 0.8715277777777778 | 0 |
| 0.8722222222222222 | 0 |
| 0.8729166666666667 | 0 |
| 0.873611111111111 | 0 |
| 0.8743055555555556 | 0 |
| 0.875 | 0 |
| 0.8756944444444444 | 0 |
| 0.876388888888889 | 0 |
| 0.8770833333333333 | 0 |
| 0.8777777777777778 | 0 |
| 0.8784722222222222 | 0 |
| 0.8791666666666668 | 0 |
| 0.8798611111111111 | 0 |
| 0.8805555555555555 | 0 |
| 0.88125 | 0 |
| 0.8819444444444445 | 0 |
| 0.8826388888888889 | 0 |
| 0.8833333333333333 | 0 |
| 0.8840277777777777 | 0 |
| 0.8847222222222223 | 0 |
| 0.8854166666666666 | 0 |
| 0.8861111111111111 | 0 |
| 0.8868055555555556 | 0 |
| 0.8875000000000001 | 0 |
| 0.8881944444444444 | 0 |
| 0.8888888888888888 | 0 |
| 0.8895833333333334 | 0 |
| 0.8902777777777778 | 0 |
| 0.8909722222222222 | 0 |
| 0.8916666666666666 | 0 |
| 0.8923611111111112 | 0 |
| 0.8930555555555556 | 0 |
| 0.8937499999999999 | 0 |
| 0.8944444444444444 | 0 |
| 0.8951388888888889 | 0 |
| 0.8958333333333334 | 0 |
| 0.8965277777777777 | 0 |
| 0.8972222222222223 | 0 |
| 0.8979166666666667 | 0 |
| 0.8986111111111111 | 0 |
| 0.8993055555555555 | 0 |
| 0.9 | 0 |
| 0.9006944444444445 | 0 |
| 0.9013888888888889 | 0 |
| 0.9020833333333332 | 0 |
| 0.9027777777777778 | 0 |
| 0.9034722222222222 | 0 |
| 0.9041666666666667 | 0 |
| 0.904861111111111 | 0 |
| 0.9055555555555556 | 0 |
| 0.90625 | 0 |
| 0.9069444444444444 | 0 |
| 0.907638888888889 | 0 |
| 0.9083333333333333 | 0 |
| 0.9090277777777778 | 0 |
| 0.9097222222222222 | 0 |
| 0.9104166666666668 | 0 |
| 0.9111111111111111 | 0 |
| 0.9118055555555555 | 0 |
| 0.9125 | 0 |
| 0.9131944444444445 | 0 |
| 0.9138888888888889 | 0 |
| 0.9145833333333333 | 0 |
| 0.9152777777777777 | 0 |
| 0.9159722222222223 | 0 |
| 0.9166666666666666 | 0 |
| 0.9173611111111111 | 0 |
| 0.9180555555555556 | 0 |
| 0.9187500000000001 | 0 |
| 0.9194444444444444 | 0 |
| 0.9201388888888888 | 0 |
| 0.9208333333333334 | 0 |
| 0.9215277777777778 | 0 |
| 0.9222222222222222 | 0 |
| 0.9229166666666666 | 0 |
| 0.9236111111111112 | 0 |
| 0.9243055555555556 | 0 |
| 0.9249999999999999 | 0 |
| 0.9256944444444444 | 0 |
| 0.9263888888888889 | 0 |
| 0.9270833333333334 | 0 |
| 0.9277777777777777 | 0 |
| 0.9284722222222223 | 0 |
| 0.9291666666666667 | 0 |
| 0.9298611111111111 | 0 |
| 0.9305555555555555 | 0 |
| 0.93125 | 0 |
| 0.9319444444444445 | 0 |
| 0.9326388888888889 | 0 |
| 0.9333333333333332 | 0 |
| 0.9340277777777778 | 0 |
| 0.9347222222222222 | 0 |
| 0.9354166666666667 | 0 |
| 0.936111111111111 | 0 |
| 0.9368055555555556 | 0 |
| 0.9375 | 0 |
| 0.9381944444444444 | 0 |
| 0.938888888888889 | 0 |
| 0.9395833333333333 | 0 |
| 0.9402777777777778 | 0 |
| 0.9409722222222222 | 0 |
| 0.9416666666666668 | 0 |
| 0.9423611111111111 | 0 |
| 0.9430555555555555 | 0 |
| 0.94375 | 0 |
| 0.9444444444444445 | 0 |
| 0.9451388888888889 | 0 |
| 0.9458333333333333 | 0 |
| 0.9465277777777777 | 0 |
| 0.9472222222222223 | 0 |
| 0.9479166666666666 | 0 |
| 0.9486111111111111 | 0 |
| 0.9493055555555556 | 0 |
| 0.9500000000000001 | 0 |
| 0.9506944444444444 | 0 |
| 0.9513888888888888 | 0 |
| 0.9520833333333334 | 0 |
| 0.9527777777777778 | 0 |
| 0.9534722222222222 | 0 |
| 0.9541666666666666 | 0 |
| 0.9548611111111112 | 0 |
| 0.9555555555555556 | 0 |
| 0.9562499999999999 | 0 |
| 0.9569444444444444 | 0 |
| 0.9576388888888889 | 0 |
| 0.9583333333333334 | 0 |
| 0.9590277777777777 | 0 |
| 0.9597222222222223 | 0 |
| 0.9604166666666667 | 0 |
| 0.9611111111111111 | 0 |
| 0.9618055555555555 | 0 |
| 0.9625 | 0 |
| 0.9631944444444445 | 0 |
| 0.9638888888888889 | 0 |
| 0.9645833333333332 | 0 |
| 0.9652777777777778 | 0 |
| 0.9659722222222222 | 0 |
| 0.9666666666666667 | 0 |
| 0.967361111111111 | 0 |
| 0.9680555555555556 | 0 |
| 0.96875 | 0 |
| 0.9694444444444444 | 0 |
| 0.970138888888889 | 0 |
| 0.9708333333333333 | 0 |
| 0.9715277777777778 | 0 |
| 0.9722222222222222 | 0 |
| 0.9729166666666668 | 0 |
| 0.9736111111111111 | 0 |
| 0.9743055555555555 | 0 |
| 0.975 | 0 |
| 0.9756944444444445 | 0 |
| 0.9763888888888889 | 0 |
| 0.9770833333333333 | 0 |
| 0.9777777777777777 | 0 |
| 0.9784722222222223 | 0 |
| 0.9791666666666666 | 0 |
| 0.9798611111111111 | 0 |
| 0.9805555555555556 | 0 |
| 0.9812500000000001 | 0 |
| 0.9819444444444444 | 0 |
| 0.9826388888888888 | 0 |
| 0.9833333333333334 | 0 |
| 0.9840277777777778 | 0 |
| 0.9847222222222222 | 0 |
| 0.9854166666666666 | 0 |
| 0.9861111111111112 | 0 |
| 0.9868055555555556 | 0 |
| 0.9874999999999999 | 0 |
| 0.9881944444444444 | 0 |
| 0.9888888888888889 | 0 |
| 0.9895833333333334 | 0 |
| 0.9902777777777777 | 0 |
| 0.9909722222222223 | 0 |
| 0.9916666666666667 | 0 |
| 0.9923611111111111 | 0 |
| 0.9930555555555555 | 0 |
| 0.99375 | 0 |
| 0.9944444444444445 | 0 |
| 0.9951388888888889 | 0 |
| 0.9958333333333332 | 0 |
| 0.9965277777777778 | 0 |
| 0.9972222222222222 | 0 |
| 0.9979166666666667 | 0 |
| 0.998611111111111 | 0 |
| 0.9993055555555556 | 0 |